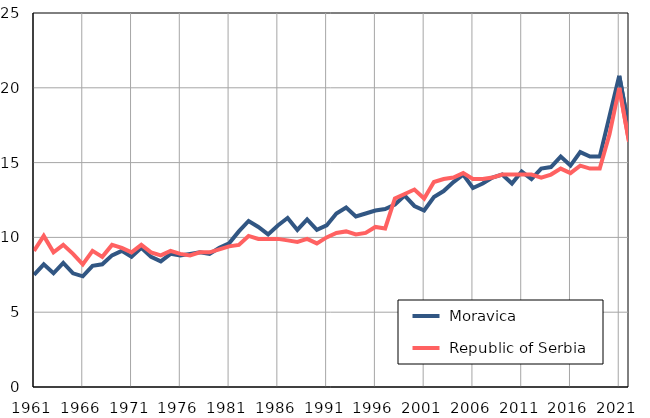
| Category |  Moravica |  Republic of Serbia |
|---|---|---|
| 1961.0 | 7.5 | 9.1 |
| 1962.0 | 8.2 | 10.1 |
| 1963.0 | 7.6 | 9 |
| 1964.0 | 8.3 | 9.5 |
| 1965.0 | 7.6 | 8.9 |
| 1966.0 | 7.4 | 8.2 |
| 1967.0 | 8.1 | 9.1 |
| 1968.0 | 8.2 | 8.7 |
| 1969.0 | 8.8 | 9.5 |
| 1970.0 | 9.1 | 9.3 |
| 1971.0 | 8.7 | 9 |
| 1972.0 | 9.3 | 9.5 |
| 1973.0 | 8.7 | 9 |
| 1974.0 | 8.4 | 8.8 |
| 1975.0 | 8.9 | 9.1 |
| 1976.0 | 8.8 | 8.9 |
| 1977.0 | 8.9 | 8.8 |
| 1978.0 | 9 | 9 |
| 1979.0 | 8.9 | 9 |
| 1980.0 | 9.3 | 9.2 |
| 1981.0 | 9.6 | 9.4 |
| 1982.0 | 10.4 | 9.5 |
| 1983.0 | 11.1 | 10.1 |
| 1984.0 | 10.7 | 9.9 |
| 1985.0 | 10.2 | 9.9 |
| 1986.0 | 10.8 | 9.9 |
| 1987.0 | 11.3 | 9.8 |
| 1988.0 | 10.5 | 9.7 |
| 1989.0 | 11.2 | 9.9 |
| 1990.0 | 10.5 | 9.6 |
| 1991.0 | 10.8 | 10 |
| 1992.0 | 11.6 | 10.3 |
| 1993.0 | 12 | 10.4 |
| 1994.0 | 11.4 | 10.2 |
| 1995.0 | 11.6 | 10.3 |
| 1996.0 | 11.8 | 10.7 |
| 1997.0 | 11.9 | 10.6 |
| 1998.0 | 12.2 | 12.6 |
| 1999.0 | 12.8 | 12.9 |
| 2000.0 | 12.1 | 13.2 |
| 2001.0 | 11.8 | 12.6 |
| 2002.0 | 12.7 | 13.7 |
| 2003.0 | 13.1 | 13.9 |
| 2004.0 | 13.7 | 14 |
| 2005.0 | 14.2 | 14.3 |
| 2006.0 | 13.3 | 13.9 |
| 2007.0 | 13.6 | 13.9 |
| 2008.0 | 14 | 14 |
| 2009.0 | 14.2 | 14.2 |
| 2010.0 | 13.6 | 14.2 |
| 2011.0 | 14.4 | 14.2 |
| 2012.0 | 13.9 | 14.2 |
| 2013.0 | 14.6 | 14 |
| 2014.0 | 14.7 | 14.2 |
| 2015.0 | 15.4 | 14.6 |
| 2016.0 | 14.8 | 14.3 |
| 2017.0 | 15.7 | 14.8 |
| 2018.0 | 15.4 | 14.6 |
| 2019.0 | 15.4 | 14.6 |
| 2020.0 | 18.1 | 16.9 |
| 2021.0 | 20.8 | 20 |
| 2022.0 | 17.3 | 16.4 |